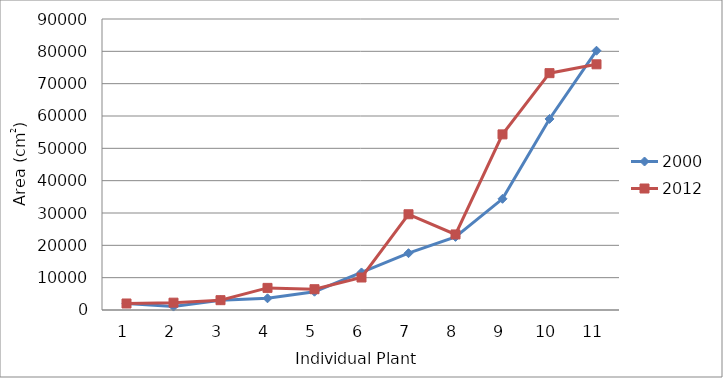
| Category | 2000 | 2012 |
|---|---|---|
| 0 | 2000 | 2012 |
| 1 | 1061.32 | 2267.08 |
| 2 | 3039.52 | 3039.52 |
| 3 | 3617.28 | 6838.92 |
| 4 | 5652 | 6430.72 |
| 5 | 11611.72 | 10048 |
| 6 | 17566.633 | 29610.898 |
| 7 | 22608 | 23367.88 |
| 8 | 34389.28 | 54315.72 |
| 9 | 59088.52 | 73249.92 |
| 10 | 80189.32 | 75988 |